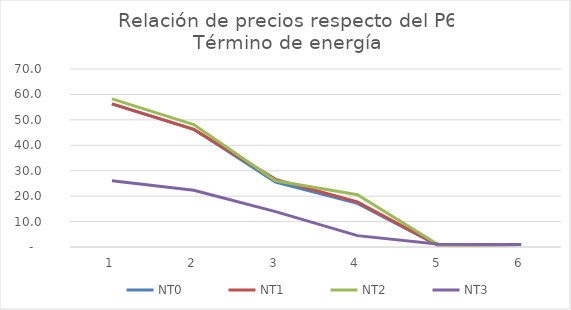
| Category | NT0 | NT1 | NT2 | NT3 |
|---|---|---|---|---|
| 0 | 56.306 | 56.283 | 58.276 | 26.089 |
| 1 | 46.291 | 46.267 | 48.139 | 22.306 |
| 2 | 25.473 | 26.587 | 26.025 | 13.928 |
| 3 | 17.162 | 17.758 | 20.565 | 4.472 |
| 4 | 0.42 | 0.466 | 0.725 | 1.058 |
| 5 | 1 | 1 | 1 | 1 |